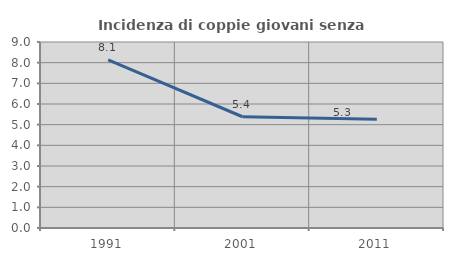
| Category | Incidenza di coppie giovani senza figli |
|---|---|
| 1991.0 | 8.13 |
| 2001.0 | 5.383 |
| 2011.0 | 5.259 |